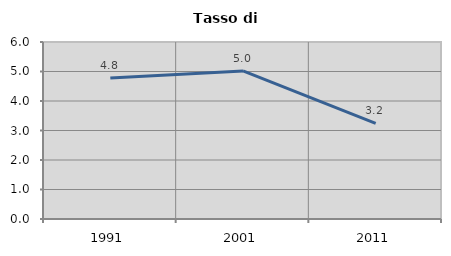
| Category | Tasso di disoccupazione   |
|---|---|
| 1991.0 | 4.783 |
| 2001.0 | 5.021 |
| 2011.0 | 3.239 |